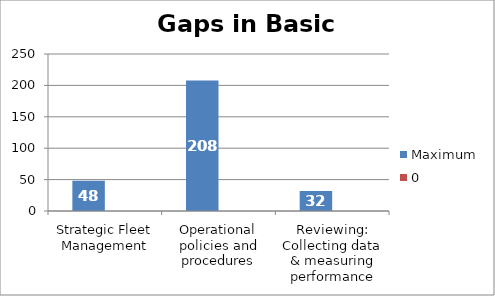
| Category | Maximum | 0 |
|---|---|---|
| Strategic Fleet Management | 48 | 0 |
| Operational policies and procedures | 208 | 0 |
| Reviewing: Collecting data & measuring performance | 32 | 0 |